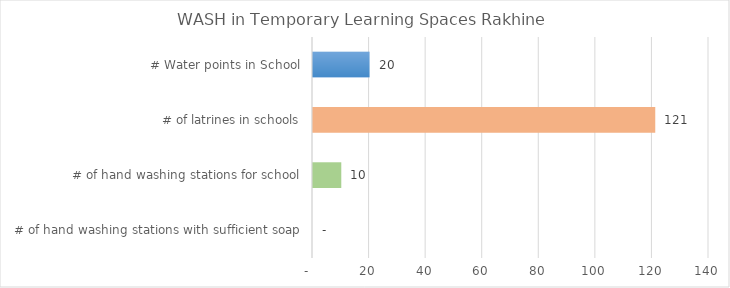
| Category | Rakhine |
|---|---|
|  # of hand washing stations with sufficient soap | 0 |
|  # of hand washing stations for school | 10 |
|  # of latrines in schools | 121 |
| # Water points in School | 20 |